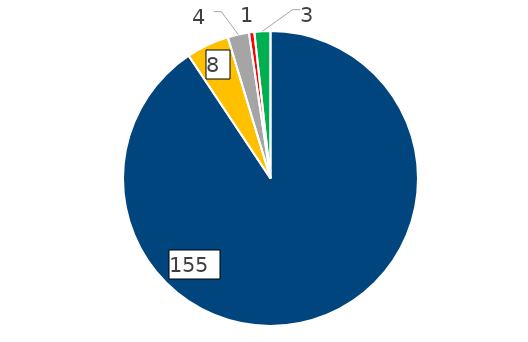
| Category | 2016 |
|---|---|
| E-mail a Transparencia CORREOS | 155 |
| Correo postal a Transparencia CORREOS | 8 |
| Portal Transparencia AGE | 4 |
| Registro general CORREOS | 1 |
| Otros | 3 |